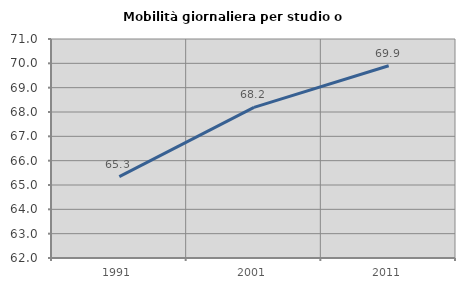
| Category | Mobilità giornaliera per studio o lavoro |
|---|---|
| 1991.0 | 65.347 |
| 2001.0 | 68.191 |
| 2011.0 | 69.9 |